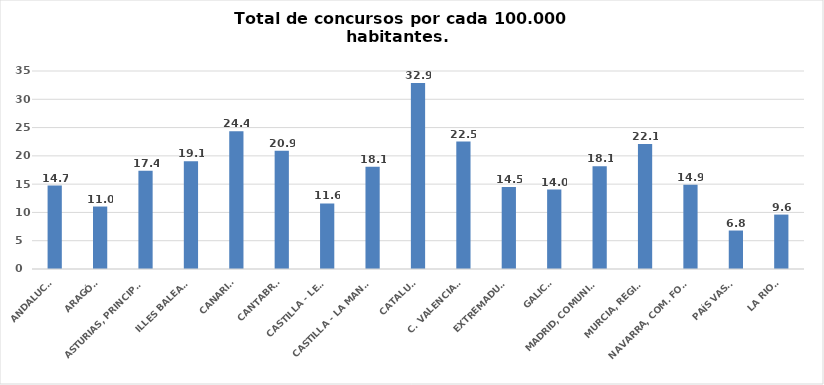
| Category | Series 0 |
|---|---|
| ANDALUCÍA | 14.74 |
| ARAGÓN | 11.043 |
| ASTURIAS, PRINCIPADO | 17.385 |
| ILLES BALEARS | 19.06 |
| CANARIAS | 24.357 |
| CANTABRIA | 20.9 |
| CASTILLA - LEÓN | 11.584 |
| CASTILLA - LA MANCHA | 18.071 |
| CATALUÑA | 32.89 |
| C. VALENCIANA | 22.517 |
| EXTREMADURA | 14.512 |
| GALICIA | 14.039 |
| MADRID, COMUNIDAD | 18.149 |
| MURCIA, REGIÓN | 22.091 |
| NAVARRA, COM. FORAL | 14.877 |
| PAÍS VASCO | 6.802 |
| LA RIOJA | 9.619 |